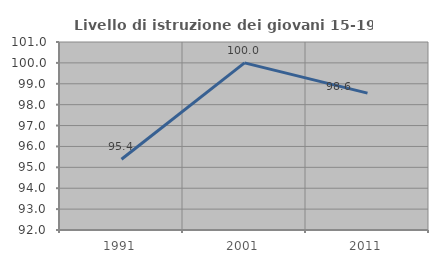
| Category | Livello di istruzione dei giovani 15-19 anni |
|---|---|
| 1991.0 | 95.385 |
| 2001.0 | 100 |
| 2011.0 | 98.551 |